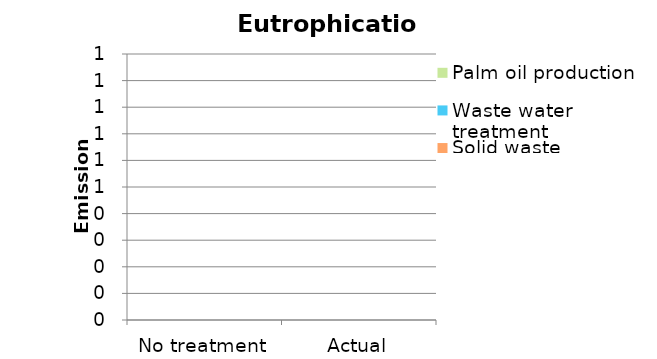
| Category | Solid waste treatment | Waste water treatment | Palm oil production |
|---|---|---|---|
| No treatment | 0 | 0 | 0 |
| Actual | 0 | 0 | 0 |